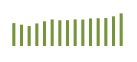
| Category | Saldo [ (1)-(2) ] |
|---|---|
| 0 | 532729.955 |
| 1 | 495602.949 |
| 2 | 464912.543 |
| 3 | 524886.84 |
| 4 | 575003.691 |
| 5 | 617133.535 |
| 6 | 598394.561 |
| 7 | 601130.812 |
| 8 | 618778.996 |
| 9 | 613783.089 |
| 10 | 640835.074 |
| 11 | 645614.486 |
| 12 | 650194 |
| 13 | 689934.963 |
| 14 | 758215.887 |